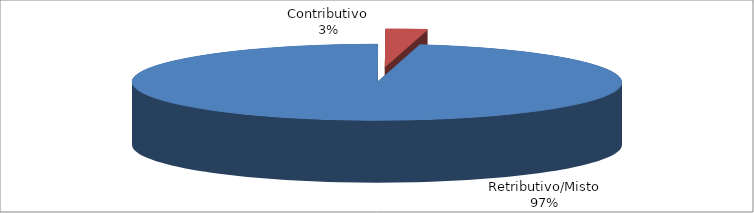
| Category | Series 1 |
|---|---|
| Retributivo/Misto | 31055 |
| Contributivo | 873 |